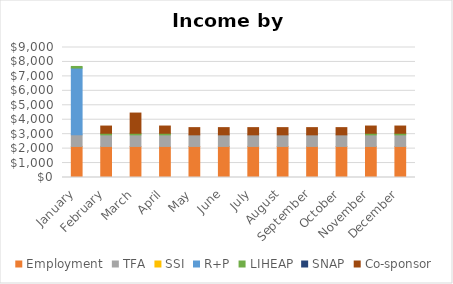
| Category | Employment | TFA | SSI | R+P | LIHEAP | SNAP | Co-sponsor |
|---|---|---|---|---|---|---|---|
| January | 2150 | 803 | 0 | 4625 | 110 | 0 | 0 |
| February | 2150 | 803 | 0 | 0 | 110 | 0 | 498.5 |
| March | 2150 | 803 | 0 | 0 | 110 | 0 | 1398.5 |
| April | 2150 | 803 | 0 | 0 | 110 | 0 | 500 |
| May | 2150 | 803 | 0 | 0 | 0 | 0 | 500 |
| June | 2150 | 803 | 0 | 0 | 0 | 0 | 500 |
| July | 2150 | 803 | 0 | 0 | 0 | 0 | 500 |
| August | 2150 | 803 | 0 | 0 | 0 | 0 | 500 |
| September | 2150 | 803 | 0 | 0 | 0 | 0 | 500 |
| October | 2150 | 803 | 0 | 0 | 0 | 0 | 500 |
| November | 2150 | 803 | 0 | 0 | 110 | 0 | 500 |
| December | 2150 | 803 | 0 | 0 | 110 | 0 | 500 |